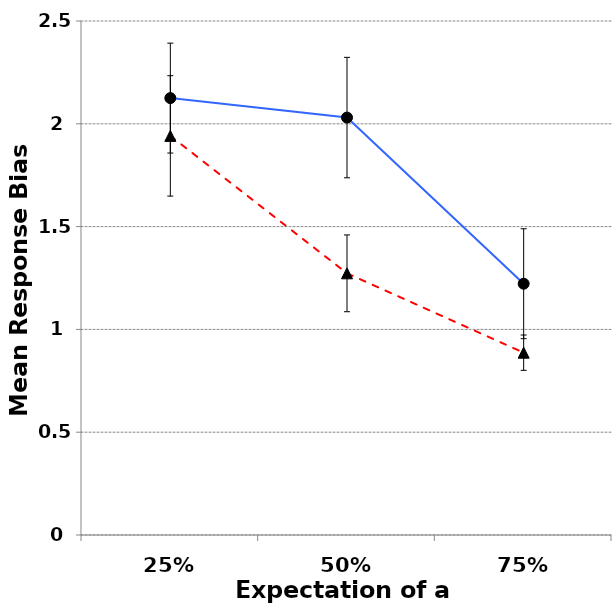
| Category | Series1 | Series2 |
|---|---|---|
| 25% | 2.125 | 1.941 |
| 50% | 2.03 | 1.273 |
| 75% | 1.222 | 0.887 |